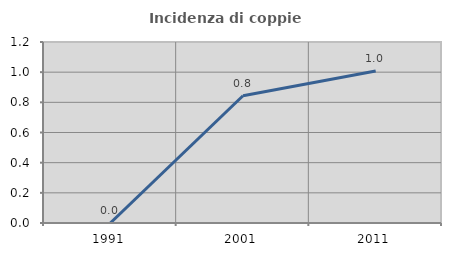
| Category | Incidenza di coppie miste |
|---|---|
| 1991.0 | 0 |
| 2001.0 | 0.844 |
| 2011.0 | 1.008 |